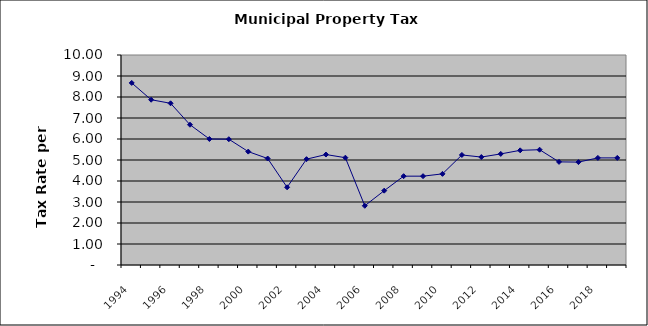
| Category | Rate |
|---|---|
| 1994.0 | 8.67 |
| 1995.0 | 7.87 |
| 1996.0 | 7.7 |
| 1997.0 | 6.68 |
| 1998.0 | 6 |
| 1999.0 | 5.99 |
| 2000.0 | 5.4 |
| 2001.0 | 5.07 |
| 2002.0 | 3.7 |
| 2003.0 | 5.04 |
| 2004.0 | 5.26 |
| 2005.0 | 5.11 |
| 2006.0 | 2.82 |
| 2007.0 | 3.54 |
| 2008.0 | 4.23 |
| 2009.0 | 4.23 |
| 2010.0 | 4.34 |
| 2011.0 | 5.24 |
| 2012.0 | 5.14 |
| 2013.0 | 5.29 |
| 2014.0 | 5.46 |
| 2015.0 | 5.49 |
| 2016.0 | 4.91 |
| 2017.0 | 4.9 |
| 2018.0 | 5.1 |
| 2019.0 | 5.1 |